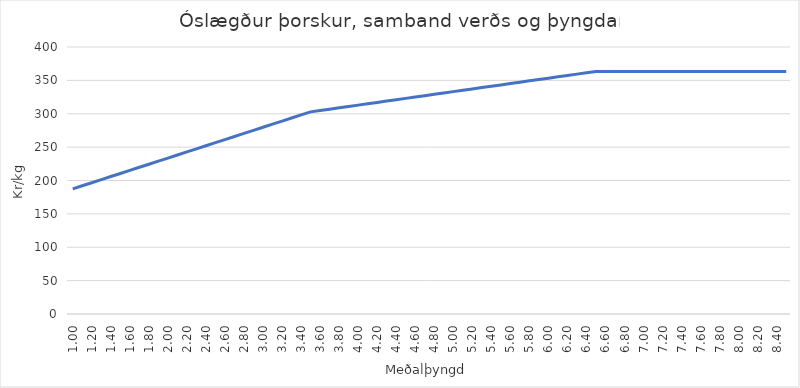
| Category | Series 0 |
|---|---|
| 1.0 | 187.474 |
| 1.1 | 192.089 |
| 1.2 | 196.704 |
| 1.3 | 201.318 |
| 1.4 | 205.933 |
| 1.5 | 210.548 |
| 1.6 | 215.163 |
| 1.7 | 219.777 |
| 1.8 | 224.392 |
| 1.9 | 229.007 |
| 2.0 | 233.622 |
| 2.1 | 238.236 |
| 2.2 | 242.851 |
| 2.3 | 247.466 |
| 2.4 | 252.081 |
| 2.5 | 256.695 |
| 2.6 | 261.31 |
| 2.7 | 265.925 |
| 2.8 | 270.54 |
| 2.9 | 275.154 |
| 3.0 | 279.769 |
| 3.1 | 284.384 |
| 3.2 | 288.999 |
| 3.3 | 293.613 |
| 3.4 | 298.228 |
| 3.5 | 302.843 |
| 3.6 | 304.862 |
| 3.7 | 306.881 |
| 3.8 | 308.9 |
| 3.9 | 310.919 |
| 4.0 | 312.938 |
| 4.1 | 314.957 |
| 4.2 | 316.975 |
| 4.3 | 318.994 |
| 4.4 | 321.013 |
| 4.5 | 323.032 |
| 4.6 | 325.051 |
| 4.7 | 327.07 |
| 4.8 | 329.089 |
| 4.9 | 331.108 |
| 5.0 | 333.127 |
| 5.1 | 335.146 |
| 5.2 | 337.165 |
| 5.3 | 339.184 |
| 5.4 | 341.203 |
| 5.5 | 343.222 |
| 5.6 | 345.241 |
| 5.7 | 347.26 |
| 5.8 | 349.279 |
| 5.9 | 351.298 |
| 6.0 | 353.317 |
| 6.1 | 355.336 |
| 6.2 | 357.355 |
| 6.3 | 359.373 |
| 6.4 | 361.392 |
| 6.50000000000001 | 363.411 |
| 6.6 | 363.411 |
| 6.7 | 363.411 |
| 6.80000000000001 | 363.411 |
| 6.90000000000001 | 363.411 |
| 7.00000000000001 | 363.411 |
| 7.100000000000009 | 363.411 |
| 7.200000000000009 | 363.411 |
| 7.300000000000009 | 363.411 |
| 7.400000000000008 | 363.411 |
| 7.500000000000008 | 363.411 |
| 7.600000000000008 | 363.411 |
| 7.700000000000007 | 363.411 |
| 7.800000000000007 | 363.411 |
| 7.900000000000007 | 363.411 |
| 8.000000000000007 | 363.411 |
| 8.100000000000007 | 363.411 |
| 8.200000000000006 | 363.411 |
| 8.300000000000006 | 363.411 |
| 8.400000000000006 | 363.411 |
| 8.500000000000005 | 363.411 |